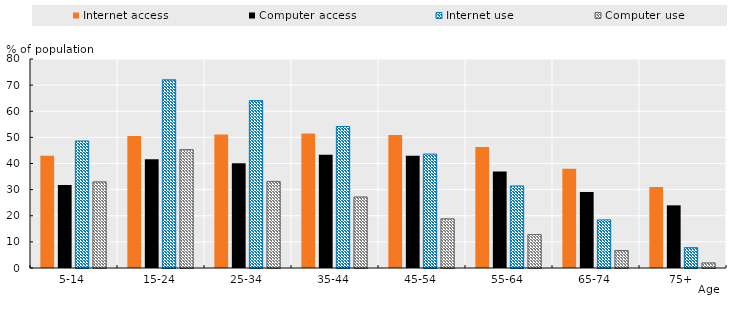
| Category | Internet access | Computer access | Internet use | Computer use |
|---|---|---|---|---|
| 5-14 | 42.919 | 31.789 | 48.622 | 32.982 |
| 15-24 | 50.565 | 41.627 | 72.051 | 45.309 |
| 25-34 | 51.056 | 40.107 | 64.078 | 33.151 |
| 35-44 | 51.531 | 43.309 | 54.161 | 27.206 |
| 45-54 | 50.906 | 42.963 | 43.614 | 18.817 |
| 55-64 | 46.286 | 36.937 | 31.413 | 12.783 |
| 65-74 | 38 | 29.12 | 18.424 | 6.686 |
| 75+ | 30.973 | 23.975 | 7.797 | 1.97 |